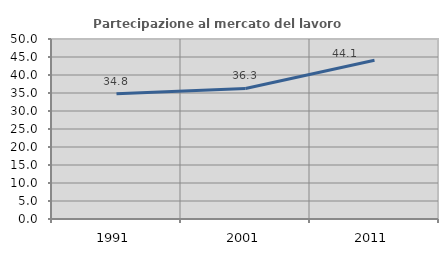
| Category | Partecipazione al mercato del lavoro  femminile |
|---|---|
| 1991.0 | 34.786 |
| 2001.0 | 36.266 |
| 2011.0 | 44.122 |